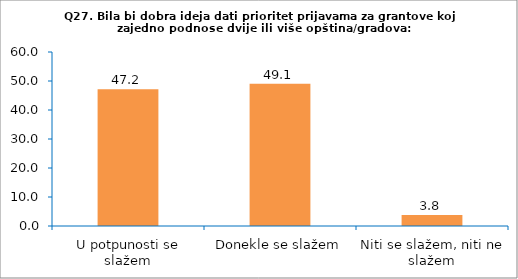
| Category | Series 0 |
|---|---|
| U potpunosti se slažem | 47.17 |
| Donekle se slažem | 49.057 |
| Niti se slažem, niti ne slažem | 3.774 |